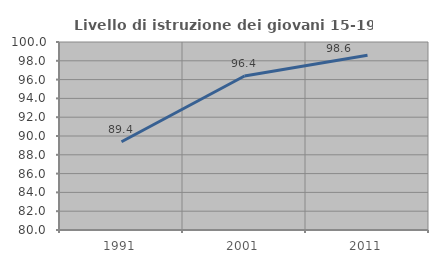
| Category | Livello di istruzione dei giovani 15-19 anni |
|---|---|
| 1991.0 | 89.385 |
| 2001.0 | 96.388 |
| 2011.0 | 98.592 |